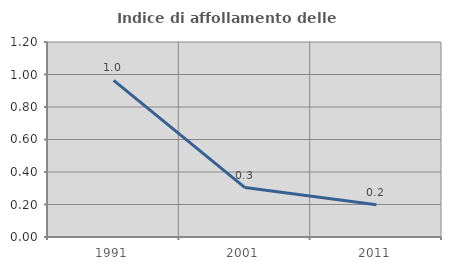
| Category | Indice di affollamento delle abitazioni  |
|---|---|
| 1991.0 | 0.964 |
| 2001.0 | 0.304 |
| 2011.0 | 0.199 |